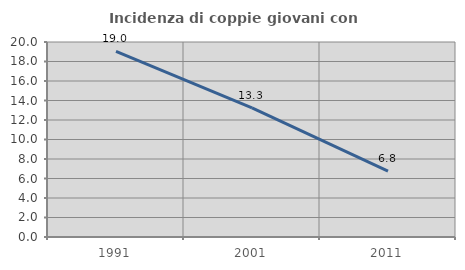
| Category | Incidenza di coppie giovani con figli |
|---|---|
| 1991.0 | 19.048 |
| 2001.0 | 13.254 |
| 2011.0 | 6.763 |